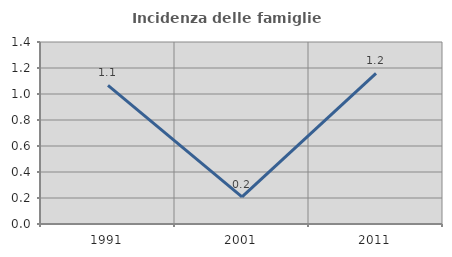
| Category | Incidenza delle famiglie numerose |
|---|---|
| 1991.0 | 1.066 |
| 2001.0 | 0.209 |
| 2011.0 | 1.158 |